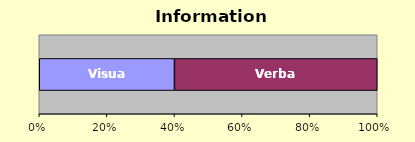
| Category | Visual | Verbal |
|---|---|---|
| 0 | 2 | 3 |